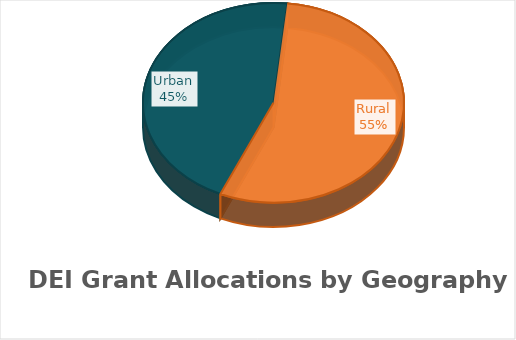
| Category | Series 0 | Series 1 |
|---|---|---|
| Urban | 8163521 | 43 |
| Rural | 9973720 | 63 |